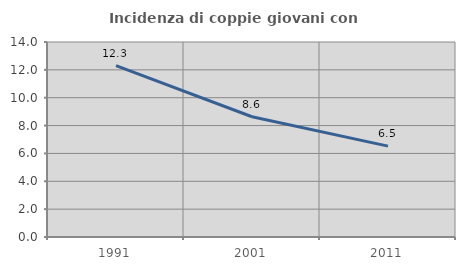
| Category | Incidenza di coppie giovani con figli |
|---|---|
| 1991.0 | 12.31 |
| 2001.0 | 8.635 |
| 2011.0 | 6.524 |